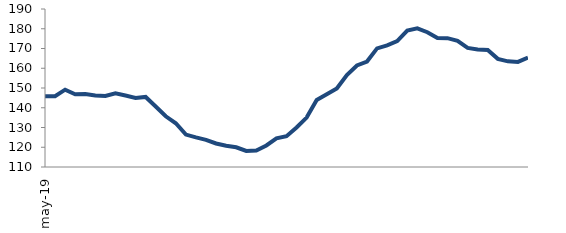
| Category | Series 1 |
|---|---|
| 2019-05-01 | 145.826 |
| 2019-06-01 | 145.804 |
| 2019-07-01 | 149.147 |
| 2019-08-01 | 146.814 |
| 2019-09-01 | 146.921 |
| 2019-10-01 | 146.216 |
| 2019-11-01 | 145.952 |
| 2019-12-01 | 147.284 |
| 2020-01-01 | 146.194 |
| 2020-02-01 | 144.98 |
| 2020-03-01 | 145.471 |
| 2020-04-01 | 140.66 |
| 2020-05-01 | 135.678 |
| 2020-06-01 | 132.14 |
| 2020-07-01 | 126.404 |
| 2020-08-01 | 124.978 |
| 2020-09-01 | 123.76 |
| 2020-10-01 | 121.904 |
| 2020-11-01 | 120.729 |
| 2020-12-01 | 119.982 |
| 2021-01-01 | 118.16 |
| 2021-02-01 | 118.385 |
| 2021-03-01 | 120.897 |
| 2021-04-01 | 124.521 |
| 2021-05-01 | 125.561 |
| 2021-06-01 | 129.991 |
| 2021-07-01 | 135.036 |
| 2021-08-01 | 143.93 |
| 2021-09-01 | 146.816 |
| 2021-10-01 | 149.733 |
| 2021-11-01 | 156.598 |
| 2021-12-01 | 161.424 |
| 2022-01-01 | 163.409 |
| 2022-02-01 | 170.051 |
| 2022-03-01 | 171.561 |
| 2022-04-01 | 173.768 |
| 2022-05-01 | 179.049 |
| 2022-06-01 | 180.219 |
| 2022-07-01 | 178.235 |
| 2022-08-01 | 175.283 |
| 2022-09-01 | 175.244 |
| 2022-10-01 | 173.855 |
| 2022-11-01 | 170.303 |
| 2022-12-01 | 169.507 |
| 2023-01-01 | 169.264 |
| 2023-02-01 | 164.751 |
| 2023-03-01 | 163.49 |
| 2023-04-01 | 163.213 |
| 2023-05-01 | 165.362 |